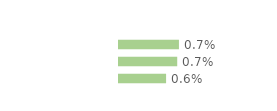
| Category | Series 0 |
|---|---|
| Immigrées | 0.007 |
| Descendantes d'immigré(s) | 0.007 |
| Ni immigrées, ni descendantes | 0.006 |